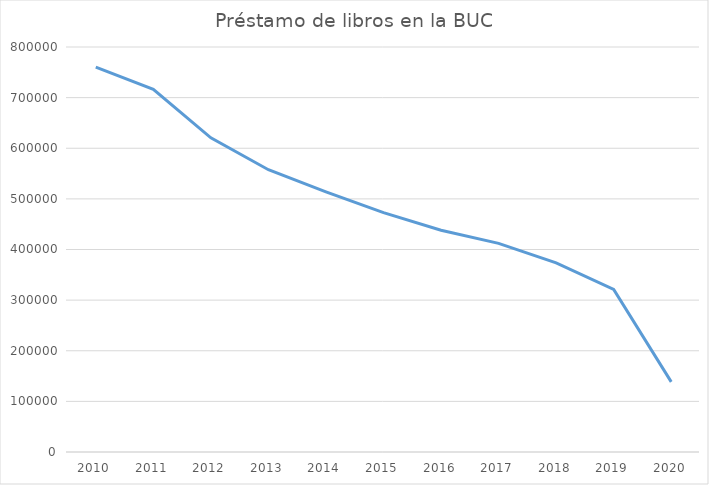
| Category | Total general |
|---|---|
| 2010.0 | 760317 |
| 2011.0 | 716442 |
| 2012.0 | 620476 |
| 2013.0 | 557512 |
| 2014.0 | 513916 |
| 2015.0 | 472807 |
| 2016.0 | 438096 |
| 2017.0 | 412185 |
| 2018.0 | 373526 |
| 2019.0 | 321166 |
| 2020.0 | 138496 |